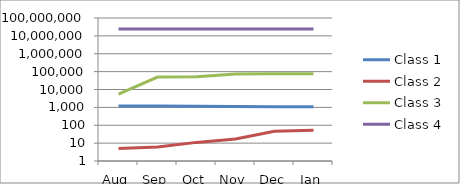
| Category | Class 1 | Class 2 | Class 3 | Class 4 |
|---|---|---|---|---|
| Aug | 1187 | 5 | 5487 | 23954318 |
| Sep | 1184 | 6 | 49493 | 23932519 |
| Oct | 1160 | 11 | 51752 | 23944918 |
| Nov | 1131 | 17 | 74030 | 23941127 |
| Dec | 1078 | 46 | 75711 | 23957573 |
| Jan | 1067 | 53 | 76685 | 23972323 |